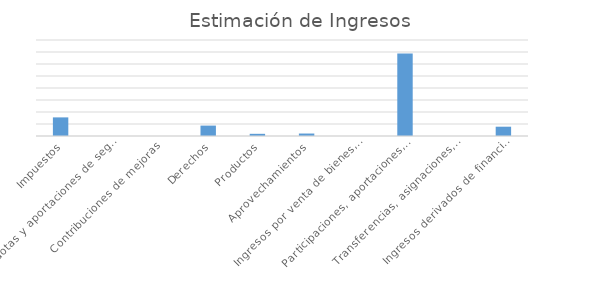
| Category | Series 0 |
|---|---|
| Impuestos | 77564693 |
| Cuotas y aportaciones de seguridad social | 0 |
| Contribuciones de mejoras | 0 |
| Derechos | 43315170 |
| Productos | 9097655 |
| Aprovechamientos | 10280197 |
| Ingresos por venta de bienes, prestación de servicios y otros ingresos | 0 |
| Participaciones, aportaciones, convenios, incentivos derivados de la colaboración fiscal y fondos distitntos de las aportaciones | 343428535 |
| Transferencias, asignaciones, subsidios y subvenciones y pensiones y jubilaciones | 0 |
| Ingresos derivados de financiamiento | 38752821 |